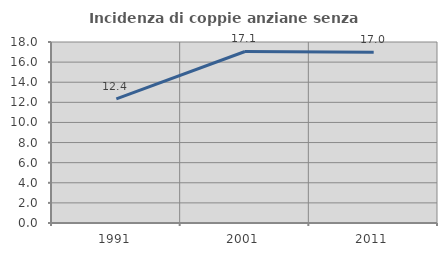
| Category | Incidenza di coppie anziane senza figli  |
|---|---|
| 1991.0 | 12.353 |
| 2001.0 | 17.057 |
| 2011.0 | 16.981 |